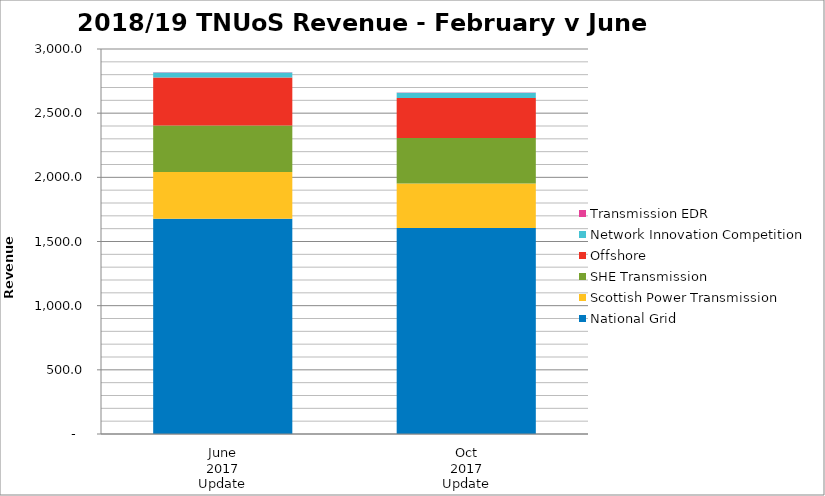
| Category | National Grid | Scottish Power Transmission | SHE Transmission | Offshore | Network Innovation Competition | Transmission EDR |
|---|---|---|---|---|---|---|
| June
2017
Update | 1677.166 | 363.761 | 363.146 | 373.184 | 40.5 | 2 |
| Oct
2017
Update | 1605.248 | 346.267 | 355.122 | 312.146 | 40.5 | 2 |